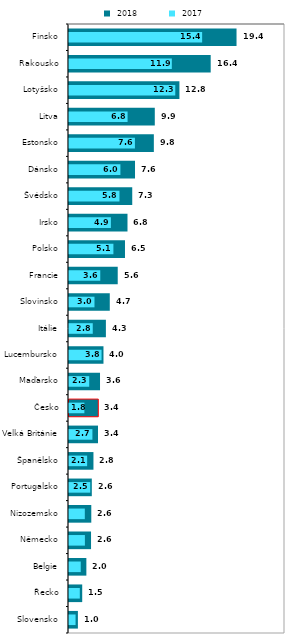
| Category |  2018 |
|---|---|
| Slovensko | 1.03 |
| Řecko | 1.53 |
| Belgie | 2.01 |
| Německo | 2.55 |
| Nizozemsko | 2.58 |
| Portugalsko | 2.64 |
| Španělsko | 2.83 |
| Velká Británie | 3.36 |
| Česko | 3.39 |
| Maďarsko | 3.59 |
| Lucembursko | 3.99 |
| Itálie | 4.27 |
| Slovinsko | 4.72 |
| Francie | 5.64 |
| Polsko | 6.48 |
| Irsko | 6.77 |
| Švédsko | 7.32 |
| Dánsko | 7.64 |
| Estonsko | 9.82 |
| Litva | 9.93 |
| Lotyšsko | 12.78 |
| Rakousko | 16.4 |
| Finsko | 19.39 |